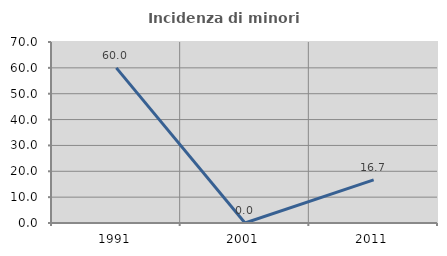
| Category | Incidenza di minori stranieri |
|---|---|
| 1991.0 | 60 |
| 2001.0 | 0 |
| 2011.0 | 16.667 |